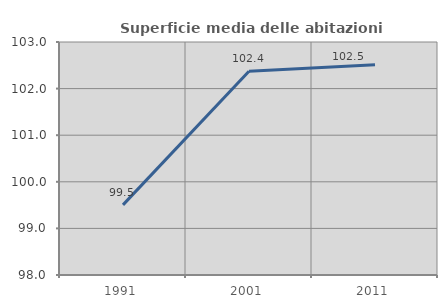
| Category | Superficie media delle abitazioni occupate |
|---|---|
| 1991.0 | 99.505 |
| 2001.0 | 102.372 |
| 2011.0 | 102.511 |